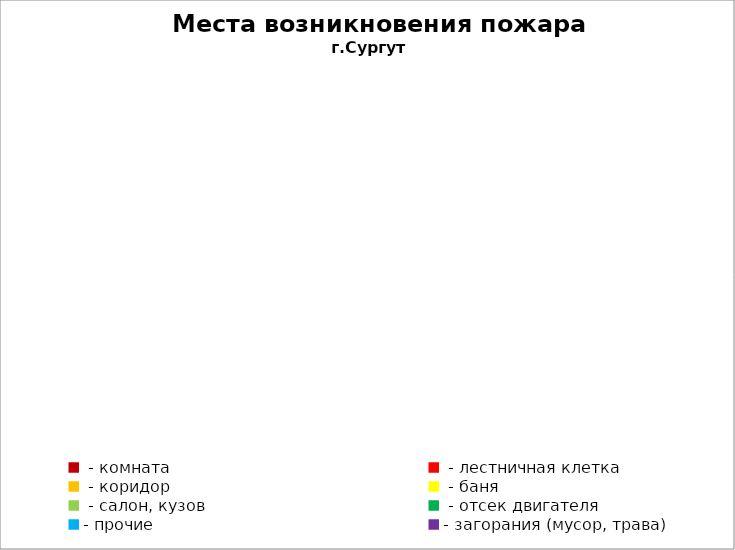
| Category | Места возникновения пожара |
|---|---|
|  - комната | 51 |
|  - лестничная клетка | 5 |
|  - коридор | 4 |
|  - баня | 23 |
|  - салон, кузов | 11 |
|  - отсек двигателя | 29 |
| - прочие | 77 |
| - загорания (мусор, трава)  | 40 |